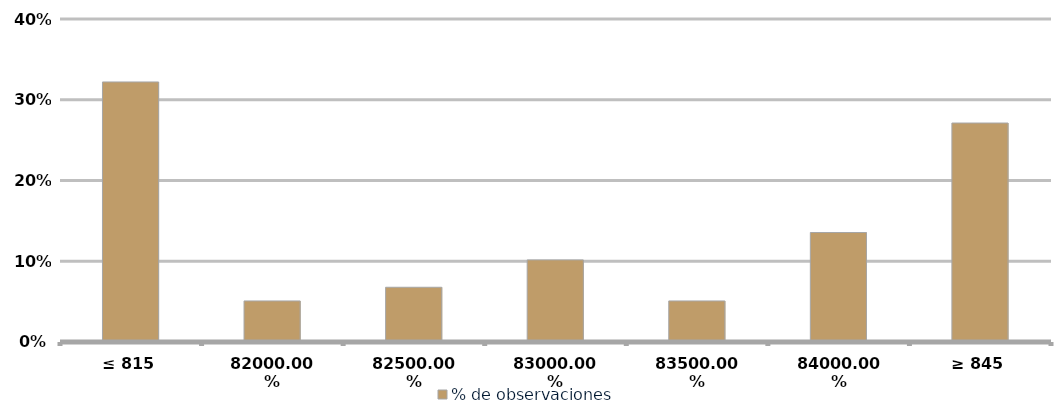
| Category | % de observaciones  |
|---|---|
| ≤ 815 | 0.322 |
| 820 | 0.051 |
| 825 | 0.068 |
| 830 | 0.102 |
| 835 | 0.051 |
| 840 | 0.136 |
| ≥ 845 | 0.271 |